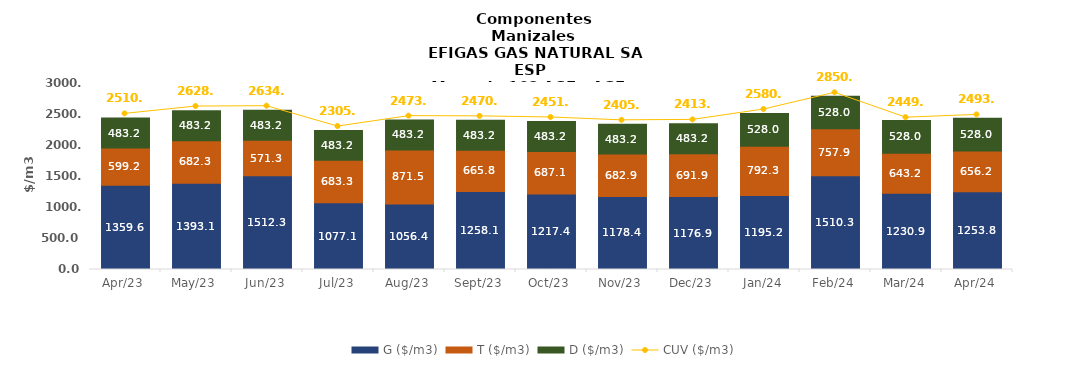
| Category | G ($/m3) | T ($/m3) | D ($/m3) |
|---|---|---|---|
| 2023-04-01 | 1359.57 | 599.24 | 483.2 |
| 2023-05-01 | 1393.1 | 682.25 | 483.2 |
| 2023-06-01 | 1512.34 | 571.34 | 483.2 |
| 2023-07-01 | 1077.14 | 683.33 | 483.2 |
| 2023-08-01 | 1056.36 | 871.51 | 483.2 |
| 2023-09-01 | 1258.12 | 665.75 | 483.2 |
| 2023-10-01 | 1217.367 | 687.084 | 483.205 |
| 2023-11-01 | 1178.421 | 682.88 | 483.205 |
| 2023-12-01 | 1176.905 | 691.935 | 483.205 |
| 2024-01-01 | 1195.188 | 792.332 | 528.046 |
| 2024-02-01 | 1510.327 | 757.913 | 528.046 |
| 2024-03-01 | 1230.885 | 643.209 | 528.046 |
| 2024-04-01 | 1253.766 | 656.178 | 528.046 |